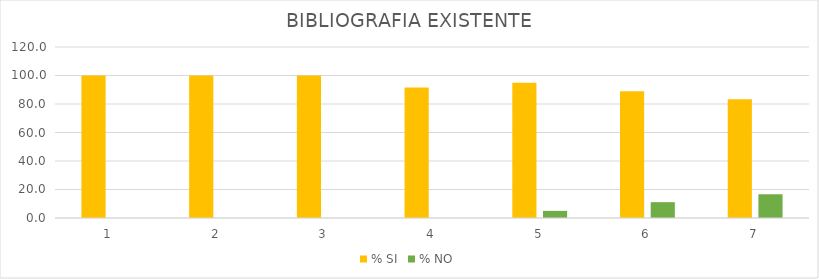
| Category | % SI | % NO |
|---|---|---|
| 0 | 100 | 0 |
| 1 | 100 | 0 |
| 2 | 100 | 0 |
| 3 | 91.667 | 0 |
| 4 | 95 | 5 |
| 5 | 88.889 | 11.111 |
| 6 | 83.333 | 16.667 |